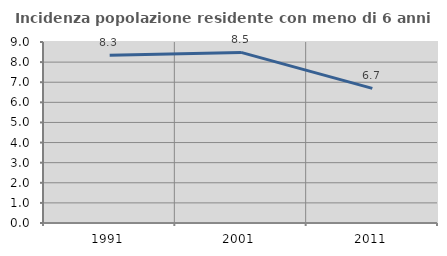
| Category | Incidenza popolazione residente con meno di 6 anni |
|---|---|
| 1991.0 | 8.34 |
| 2001.0 | 8.481 |
| 2011.0 | 6.692 |